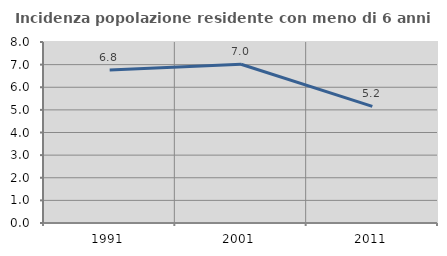
| Category | Incidenza popolazione residente con meno di 6 anni |
|---|---|
| 1991.0 | 6.766 |
| 2001.0 | 7.016 |
| 2011.0 | 5.152 |